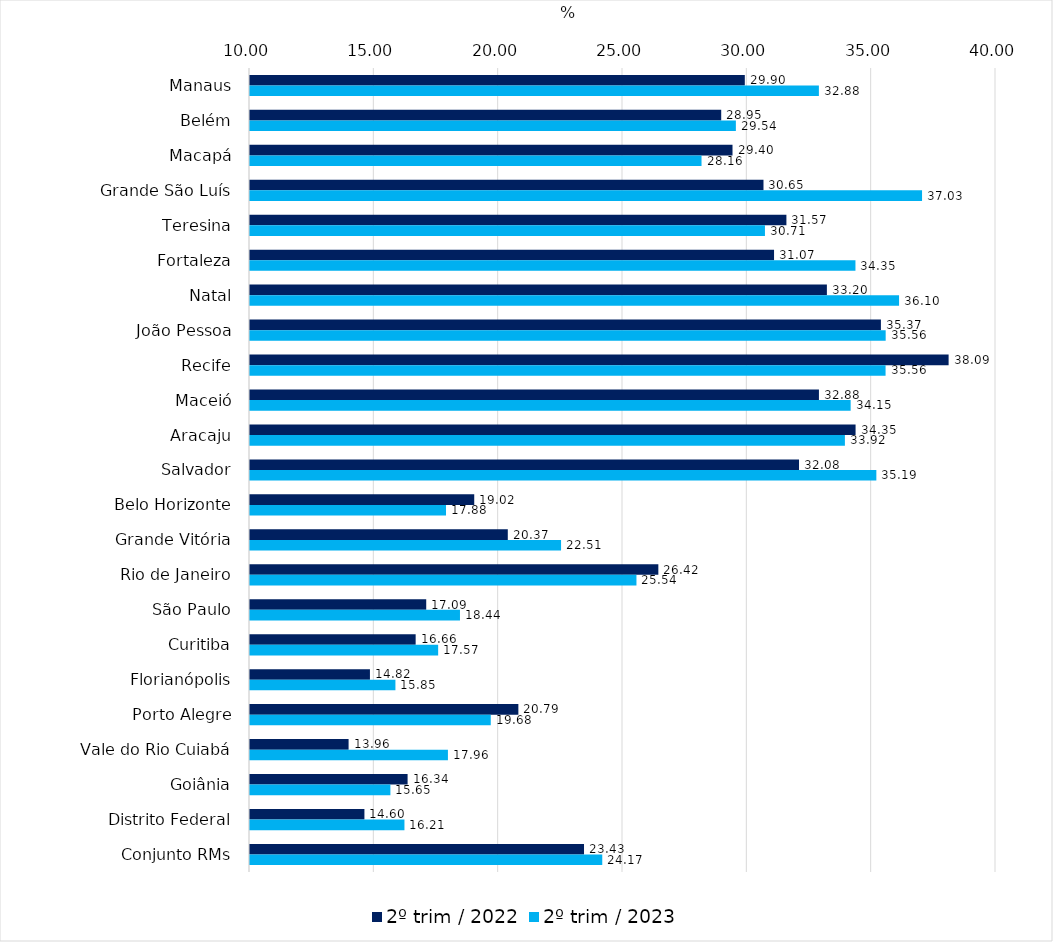
| Category | 2º trim / 2022 | 2º trim / 2023 |
|---|---|---|
| Manaus | 29.899 | 32.878 |
| Belém | 28.95 | 29.539 |
| Macapá | 29.404 | 28.158 |
| Grande São Luís | 30.65 | 37.026 |
| Teresina | 31.571 | 30.709 |
| Fortaleza | 31.074 | 34.348 |
| Natal | 33.199 | 36.102 |
| João Pessoa | 35.372 | 35.563 |
| Recife | 38.094 | 35.559 |
| Maceió | 32.879 | 34.155 |
| Aracaju | 34.353 | 33.924 |
| Salvador | 32.079 | 35.188 |
| Belo Horizonte | 19.017 | 17.882 |
| Grande Vitória | 20.367 | 22.509 |
| Rio de Janeiro | 26.421 | 25.541 |
| São Paulo | 17.087 | 18.444 |
| Curitiba | 16.662 | 17.566 |
| Florianópolis | 14.823 | 15.848 |
| Porto Alegre | 20.792 | 19.682 |
| Vale do Rio Cuiabá | 13.965 | 17.959 |
| Goiânia | 16.338 | 15.646 |
| Distrito Federal | 14.601 | 16.211 |
| Conjunto RMs | 23.432 | 24.166 |